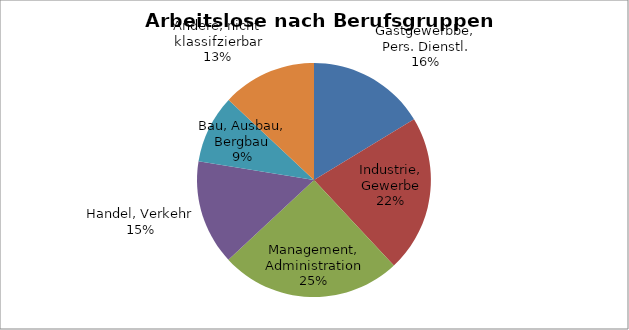
| Category | Series 0 |
|---|---|
| Gastgewerbbe, Pers. Dienstl. | 0.163 |
| Industrie, Gewerbe | 0.217 |
| Management, Administration | 0.25 |
| Handel, Verkehr | 0.145 |
| Bau, Ausbau, Bergbau | 0.094 |
| Andere, nicht klassifzierbar | 0.13 |